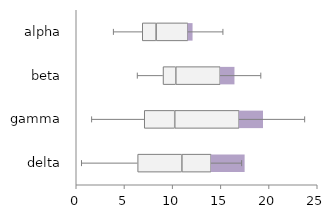
| Category | Bottom | 2Q Box | 3Q Box | Offset |
|---|---|---|---|---|
| alpha | 6.848 | 1.438 | 3.305 | 0.5 |
| beta | 9.003 | 1.322 | 4.613 | 1.5 |
| gamma | 7.052 | 3.162 | 6.683 | 2.5 |
| delta | 6.37 | 4.585 | 3.037 | 3.5 |